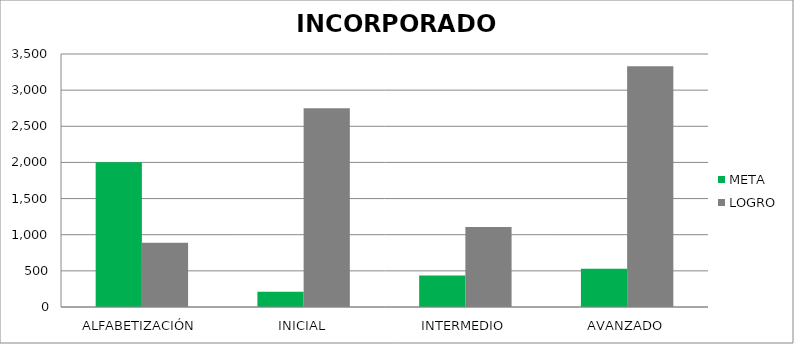
| Category | META | LOGRO |
|---|---|---|
| ALFABETIZACIÓN | 2002 | 889 |
| INICIAL | 210 | 2748 |
| INTERMEDIO | 435 | 1106 |
| AVANZADO | 528 | 3330 |